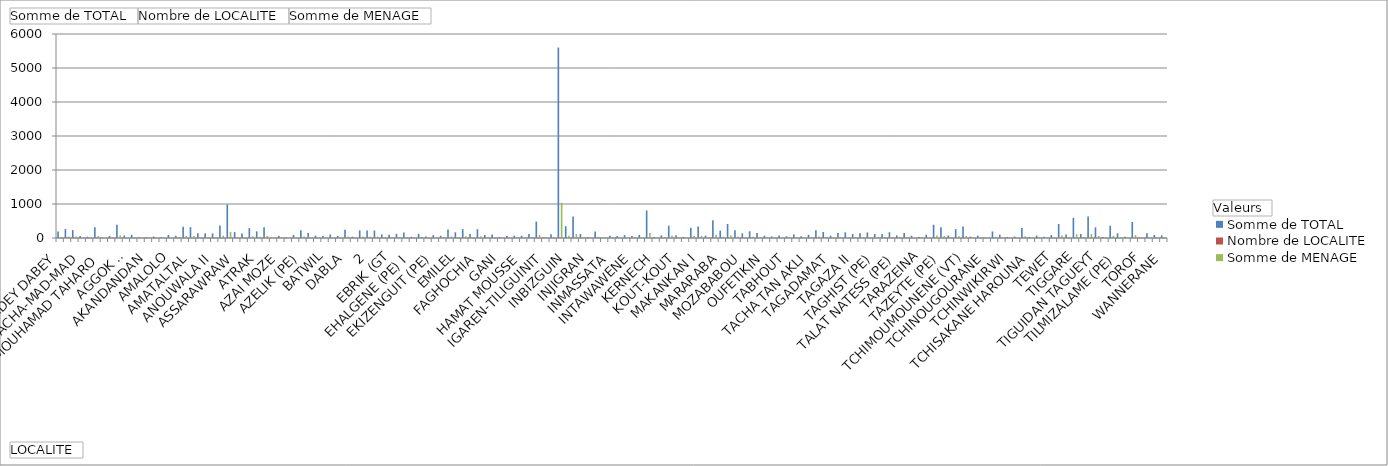
| Category | Somme de TOTAL | Nombre de LOCALITE | Somme de MENAGE |
|---|---|---|---|
| ABADEY DABEY | 193 | 1 | 36 |
| ABAJALELOM | 262 | 1 | 48 |
| ABORAK | 233 | 1 | 43 |
| ACHA-MAD-MAD | 62 | 1 | 11 |
| AFOUNOUK | 41 | 1 | 8 |
| AGABARGABAR | 319 | 1 | 59 |
| AGABARGABAR MOUHAMAD TAHARO | 14 | 1 | 3 |
| AGARAY GAREY | 62 | 1 | 11 |
| AGAYA | 391 | 1 | 72 |
| AGGOK II | 75 | 1 | 14 |
| AGGOKI I | 95 | 1 | 18 |
| AHAMED AHMED | 21 | 1 | 4 |
| AKANDANDAN | 23 | 1 | 4 |
| ALMOUKADET | 43 | 1 | 8 |
| AMACHALWANE | 20 | 1 | 4 |
| AMALOLO | 90 | 1 | 17 |
| AMAN ZAGHA NINE | 67 | 1 | 12 |
| AMANTADAN | 333 | 1 | 62 |
| AMATALTAL | 318 | 1 | 59 |
| ANOUAJJAB (PE) | 142 | 1 | 26 |
| ANOUWALA I | 136 | 1 | 25 |
| ANOUWALA II | 133 | 1 | 25 |
| ASSAMAKA | 365 | 1 | 67 |
| ASSAOUAS (ASSAWAS) | 985 | 1 | 182 |
| ASSARAWRAW | 174 | 1 | 32 |
| ASSOUMAN | 132 | 1 | 24 |
| ASSOUMAN ECOLE | 289 | 1 | 53 |
| ATRAK | 196 | 1 | 36 |
| ATTAYOUB | 318 | 1 | 59 |
| ATTOUWANE | 3 | 1 | 1 |
| AZAI MOZE | 65 | 1 | 12 |
| AZATAN | 16 | 1 | 3 |
| AZATARAYA | 91 | 1 | 17 |
| AZELIK (PE) | 229 | 1 | 42 |
| AZOULOU | 148 | 1 | 27 |
| AZZELIK (PE) | 70 | 1 | 13 |
| BATWIL | 58 | 1 | 11 |
| BINTINA | 103 | 1 | 19 |
| BOULANGUI | 60 | 1 | 11 |
| DABLA | 241 | 1 | 45 |
| DANGAREGARE | 39 | 1 | 7 |
| DARKATE 1,2,3,4 (PE) | 224 | 1 | 41 |
| EBRIK (GT | 221 | 1 | 41 |
| EDERAM | 219 | 1 | 40 |
| EFFEY-N TOULAMENE | 107 | 1 | 20 |
| EHALGENE (PE) I | 97 | 1 | 18 |
| EHALGENE (PE) II | 122 | 1 | 23 |
| EHALGENE III | 165 | 1 | 31 |
| EKIZENGUIT (PE) | 35 | 1 | 6 |
| ELAKAT | 123 | 1 | 23 |
| ELHADJI YACOUBA | 47 | 1 | 9 |
| EMILEL | 86 | 1 | 16 |
| ESSOUI MOUMINANE | 66 | 1 | 12 |
| EZAZAOU | 253 | 1 | 47 |
| FAGHOCHIA | 166 | 1 | 31 |
| FARAZAKATT | 262 | 1 | 48 |
| FOUL-FOUL | 116 | 1 | 21 |
| GANI | 260 | 1 | 48 |
| GARMAGA | 87 | 1 | 16 |
| HAMA IBRAHIM | 100 | 1 | 18 |
| HAMAT MOUSSE | 23 | 1 | 4 |
| IBADAY BADAYWAN | 60 | 1 | 11 |
| IBIZGUINE | 69 | 1 | 13 |
| IGAREN-TILIGUINIT | 67 | 1 | 12 |
| IMBORAGHANE | 115 | 1 | 21 |
| INABAGHRIT | 481 | 1 | 89 |
| INBIZGUIN | 18 | 1 | 3 |
| INBOUSSARE | 109 | 1 | 20 |
| INGALL | 5601 | 1 | 1036 |
| INJIGRAN | 347 | 2 | 64 |
| INJITAN | 636 | 1 | 118 |
| INKOUSSOUTANE | 116 | 1 | 21 |
| INMASSATA | 30 | 1 | 6 |
| INNAGAR | 188 | 2 | 35 |
| INTARAWRANI | 10 | 1 | 2 |
| INTAWAWENE | 65 | 1 | 12 |
| INWAZAB | 57 | 1 | 11 |
| KARGADJI RT | 85 | 1 | 16 |
| KERNECH | 57 | 1 | 11 |
| KITINFRI(ABATNANAGE(PE | 94 | 1 | 17 |
| KOKARI | 809 | 2 | 149 |
| KOUT-KOUT | 32 | 1 | 6 |
| LARLAR (PE) | 76 | 1 | 14 |
| LAZARAG | 361 | 1 | 67 |
| MAKANKAN I | 78 | 1 | 14 |
| MAKANKAN II | 32 | 1 | 6 |
| MARAKAT | 302 | 1 | 56 |
| MARARABA | 340 | 1 | 63 |
| MASSALAT (PE) | 71 | 1 | 13 |
| MAZABABOU (ECOLE) | 522 | 1 | 96 |
| MOZABABOU | 217 | 1 | 40 |
| N TAFOUK (PE) | 413 | 1 | 76 |
| OLY | 231 | 1 | 43 |
| OUFETIKIN | 137 | 1 | 25 |
| OURAREN | 199 | 1 | 37 |
| SORANE | 147 | 1 | 27 |
| TABHOUT | 69 | 1 | 13 |
| TABZAGOR | 46 | 1 | 9 |
| TACHA AGHALGOU(CPT) | 74 | 1 | 14 |
| TACHA TAN AKLI | 51 | 1 | 9 |
| TADEBOUK I | 107 | 1 | 20 |
| TADEBOUK II | 52 | 1 | 10 |
| TAGADAMAT | 95 | 1 | 18 |
| TAGALALT | 229 | 1 | 42 |
| TAGAZA I | 177 | 1 | 33 |
| TAGAZA II | 69 | 1 | 13 |
| TAGDOUMT ICHIRIJAN(PE | 149 | 1 | 28 |
| TAGDOUMT(PE) | 167 | 1 | 31 |
| TAGHIST (PE) | 119 | 1 | 22 |
| TAKOUKOUT | 141 | 1 | 26 |
| TALAT NAJAD (VA) | 163 | 1 | 30 |
| TALAT NATESS (PE) | 118 | 1 | 22 |
| TAMERA | 119 | 1 | 22 |
| TAMIGHAT | 170 | 1 | 31 |
| TARAZEINA | 76 | 1 | 14 |
| TARISSAT (PE) | 147 | 1 | 27 |
| TAWCHINANTE | 66 | 1 | 12 |
| TAZEYTE (PE) | 31 | 1 | 6 |
| TCHELOUT | 96 | 1 | 18 |
| TCHIGUEFAN | 389 | 1 | 72 |
| TCHIMOUMOUNENE (VT) | 317 | 1 | 59 |
| TCHINAGROF | 75 | 1 | 14 |
| TCHINAMADASSAR | 261 | 1 | 48 |
| TCHINOUGOURANE | 340 | 1 | 63 |
| TCHINSAKANAN HAROUNA | 41 | 1 | 8 |
| TCHINSAKANAN ISSOUF LAWAN | 70 | 1 | 13 |
| TCHINWIKIRWI | 13 | 1 | 2 |
| TCHINZAGHANNENE | 193 | 1 | 36 |
| TCHISAKANE GHISSA | 95 | 1 | 18 |
| TCHISAKANE HAROUNA | 33 | 1 | 6 |
| TEGAI FI N NAGAR | 45 | 1 | 8 |
| TEMALELAOU | 296 | 1 | 55 |
| TEWET | 27 | 1 | 5 |
| TIBLILIK | 71 | 1 | 13 |
| TIDEKAL | 37 | 1 | 7 |
| TIGGARE | 89 | 1 | 16 |
| TIGUE DAN TESSOUM | 410 | 1 | 76 |
| TIGUIDAN NADRAR | 106 | 1 | 20 |
| TIGUIDAN TAGUEYT | 596 | 1 | 110 |
| TIGUINDE | 119 | 1 | 22 |
| TIGUIRWIT | 630 | 1 | 116 |
| TILMIZALAME (PE) | 311 | 1 | 57 |
| TIOUMZEZE | 32 | 1 | 6 |
| TORGUIT (VT) | 359 | 1 | 66 |
| TOROF | 137 | 1 | 25 |
| TOUROUF | 38 | 1 | 7 |
| TRATCHIRJ | 471 | 1 | 87 |
| WANNERANE | 17 | 1 | 3 |
| WARAGASS | 142 | 1 | 26 |
| WOURTOURDE (PE) | 87 | 1 | 16 |
| ZODAN (CPT) | 76 | 1 | 14 |